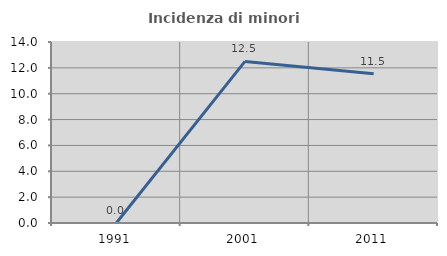
| Category | Incidenza di minori stranieri |
|---|---|
| 1991.0 | 0 |
| 2001.0 | 12.5 |
| 2011.0 | 11.538 |